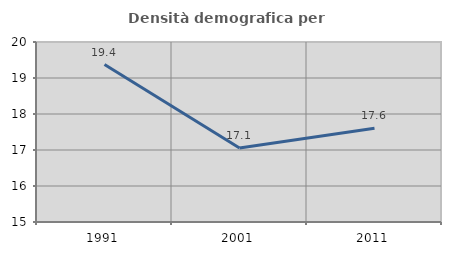
| Category | Densità demografica |
|---|---|
| 1991.0 | 19.374 |
| 2001.0 | 17.058 |
| 2011.0 | 17.605 |